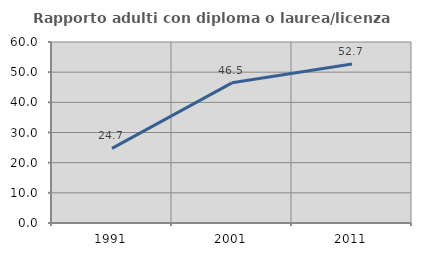
| Category | Rapporto adulti con diploma o laurea/licenza media  |
|---|---|
| 1991.0 | 24.742 |
| 2001.0 | 46.457 |
| 2011.0 | 52.713 |